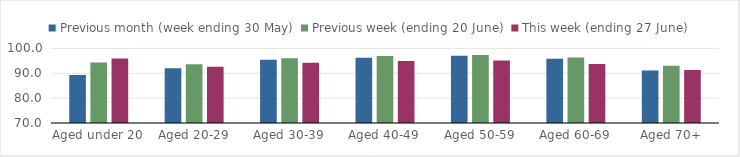
| Category | Previous month (week ending 30 May) | Previous week (ending 20 June) | This week (ending 27 June) |
|---|---|---|---|
| Aged under 20 | 89.303 | 94.314 | 95.901 |
| Aged 20-29 | 91.981 | 93.68 | 92.643 |
| Aged 30-39 | 95.479 | 96.096 | 94.2 |
| Aged 40-49 | 96.235 | 96.959 | 94.954 |
| Aged 50-59 | 97.027 | 97.384 | 95.184 |
| Aged 60-69 | 95.875 | 96.399 | 93.692 |
| Aged 70+ | 91.151 | 93.021 | 91.284 |